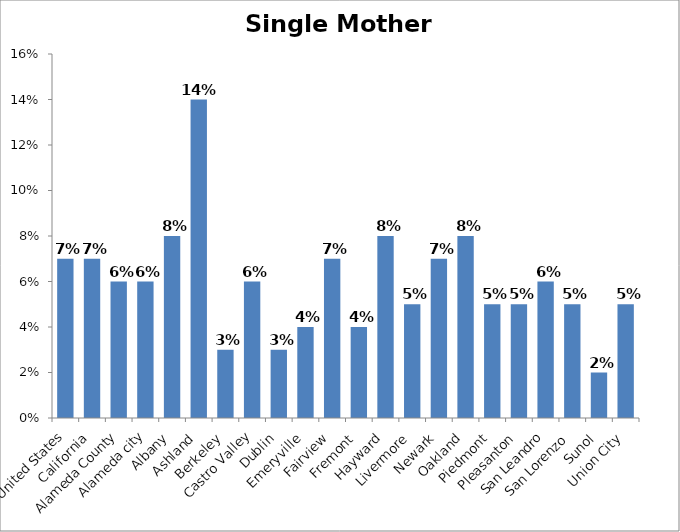
| Category | Single Mother Households |
|---|---|
| United States | 0.07 |
| California | 0.07 |
| Alameda County | 0.06 |
| Alameda city | 0.06 |
| Albany | 0.08 |
| Ashland | 0.14 |
| Berkeley | 0.03 |
| Castro Valley | 0.06 |
| Dublin | 0.03 |
| Emeryville | 0.04 |
| Fairview | 0.07 |
| Fremont | 0.04 |
| Hayward | 0.08 |
| Livermore | 0.05 |
| Newark | 0.07 |
| Oakland | 0.08 |
| Piedmont | 0.05 |
| Pleasanton | 0.05 |
| San Leandro | 0.06 |
| San Lorenzo | 0.05 |
| Sunol | 0.02 |
| Union City | 0.05 |